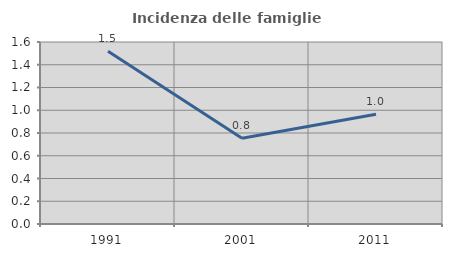
| Category | Incidenza delle famiglie numerose |
|---|---|
| 1991.0 | 1.518 |
| 2001.0 | 0.755 |
| 2011.0 | 0.965 |